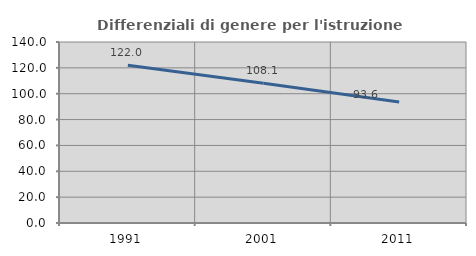
| Category | Differenziali di genere per l'istruzione superiore |
|---|---|
| 1991.0 | 121.984 |
| 2001.0 | 108.069 |
| 2011.0 | 93.62 |